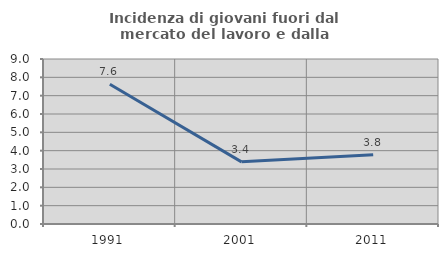
| Category | Incidenza di giovani fuori dal mercato del lavoro e dalla formazione  |
|---|---|
| 1991.0 | 7.619 |
| 2001.0 | 3.39 |
| 2011.0 | 3.774 |